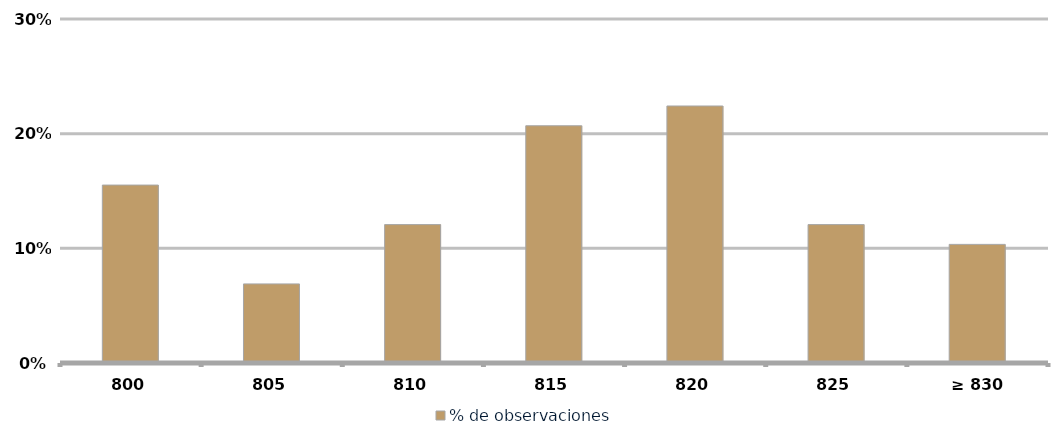
| Category | % de observaciones  |
|---|---|
|  800  | 0.155 |
|  805  | 0.069 |
|  810  | 0.121 |
|  815  | 0.207 |
|  820  | 0.224 |
| 825 | 0.121 |
|  ≥ 830  | 0.103 |